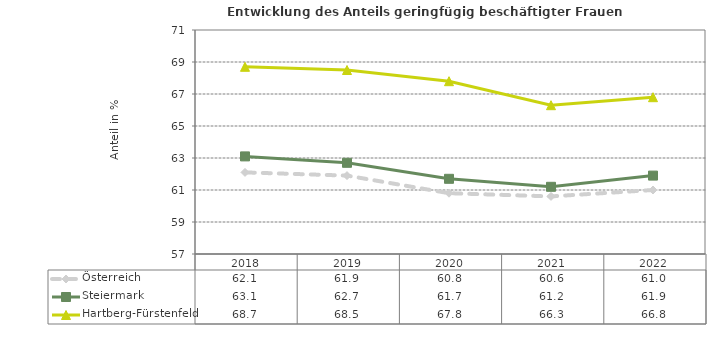
| Category | Österreich | Steiermark | Hartberg-Fürstenfeld |
|---|---|---|---|
| 2022.0 | 61 | 61.9 | 66.8 |
| 2021.0 | 60.6 | 61.2 | 66.3 |
| 2020.0 | 60.8 | 61.7 | 67.8 |
| 2019.0 | 61.9 | 62.7 | 68.5 |
| 2018.0 | 62.1 | 63.1 | 68.7 |